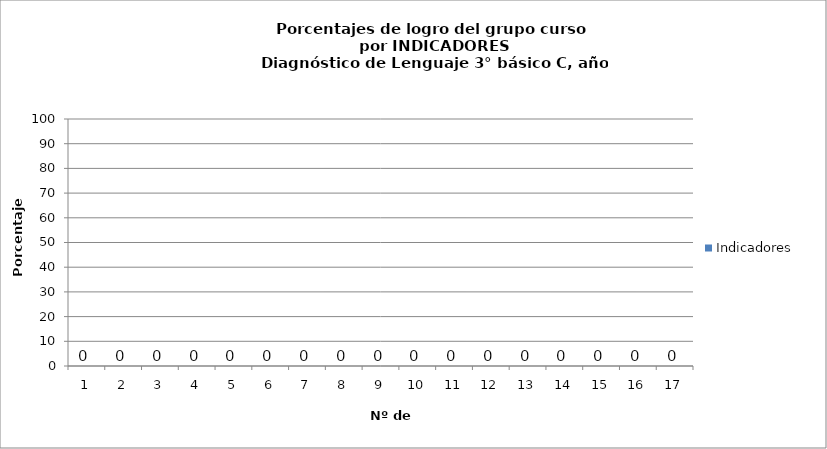
| Category | Indicadores |
|---|---|
| 0 | 0 |
| 1 | 0 |
| 2 | 0 |
| 3 | 0 |
| 4 | 0 |
| 5 | 0 |
| 6 | 0 |
| 7 | 0 |
| 8 | 0 |
| 9 | 0 |
| 10 | 0 |
| 11 | 0 |
| 12 | 0 |
| 13 | 0 |
| 14 | 0 |
| 15 | 0 |
| 16 | 0 |